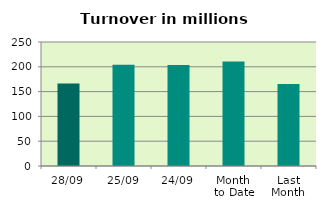
| Category | Series 0 |
|---|---|
| 28/09 | 166.325 |
| 25/09 | 204.37 |
| 24/09 | 203.535 |
| Month 
to Date | 210.603 |
| Last
Month | 165.075 |